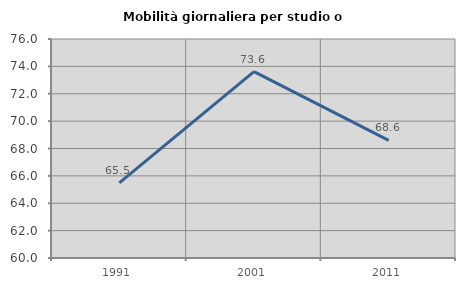
| Category | Mobilità giornaliera per studio o lavoro |
|---|---|
| 1991.0 | 65.492 |
| 2001.0 | 73.617 |
| 2011.0 | 68.591 |